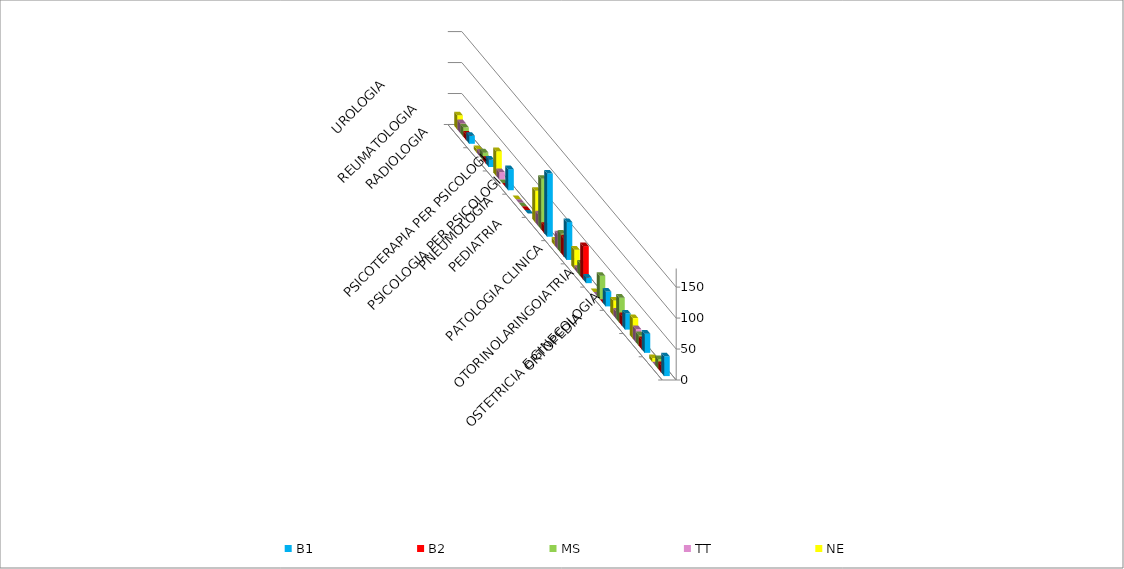
| Category | B1 | B2 | MS | TT | NE |
|---|---|---|---|---|---|
| ORTOPEDIA | 32 | 12 | 16 | 0 | 6 |
| OSTETRICIA E GINECOLOGIA | 31 | 15 | 17 | 21 | 33 |
| OTORINOLARINGOIATRIA | 26 | 16 | 40 | 12 | 24 |
| PATOLOGIA CLINICA | 24 | 0 | 38 | 0 | 0 |
| PEDIATRIA | 9 | 54 | 20 | 6 | 31 |
| PNEUMOLOGIA | 61 | 29 | 31 | 24 | 8 |
| PSICOLOGIA PER PSICOLOGI | 102 | 12 | 82 | 19 | 51 |
| PSICOTERAPIA PER PSICOLOGI | 0 | 0 | 0 | 0 | 0 |
| RADIOLOGIA | 34 | 0 | 0 | 12 | 40 |
| REUMATOLOGIA | 12 | 6 | 12 | 6 | 6 |
| UROLOGIA | 13 | 9 | 15 | 16 | 23 |